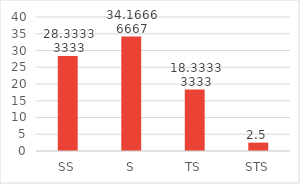
| Category | Series 0 |
|---|---|
| 0 | 28.333 |
| 1 | 34.167 |
| 2 | 18.333 |
| 3 | 2.5 |